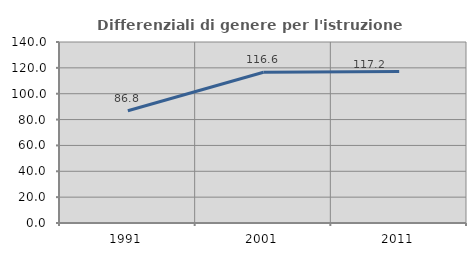
| Category | Differenziali di genere per l'istruzione superiore |
|---|---|
| 1991.0 | 86.819 |
| 2001.0 | 116.649 |
| 2011.0 | 117.236 |